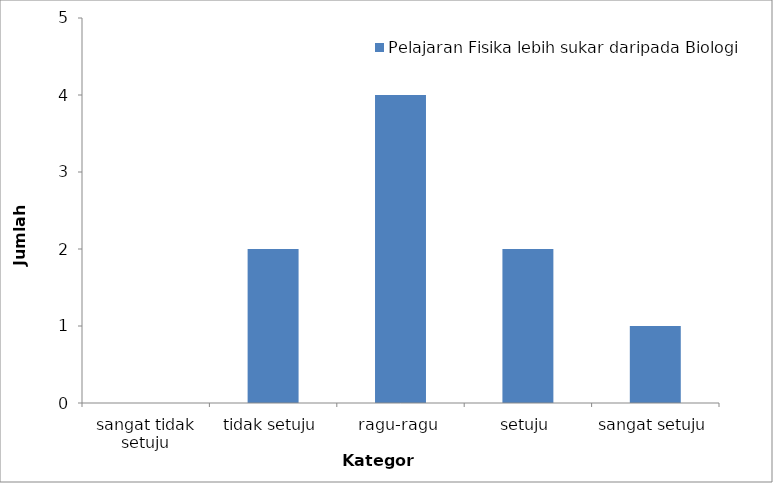
| Category | Pelajaran Fisika lebih sukar daripada Biologi |
|---|---|
| sangat tidak setuju | 0 |
| tidak setuju | 2 |
| ragu-ragu | 4 |
| setuju | 2 |
| sangat setuju | 1 |